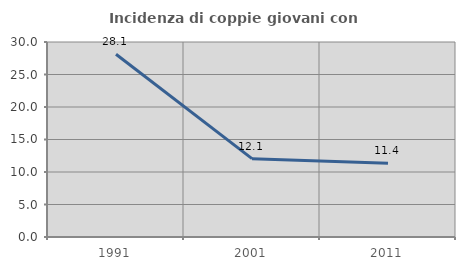
| Category | Incidenza di coppie giovani con figli |
|---|---|
| 1991.0 | 28.108 |
| 2001.0 | 12.054 |
| 2011.0 | 11.364 |